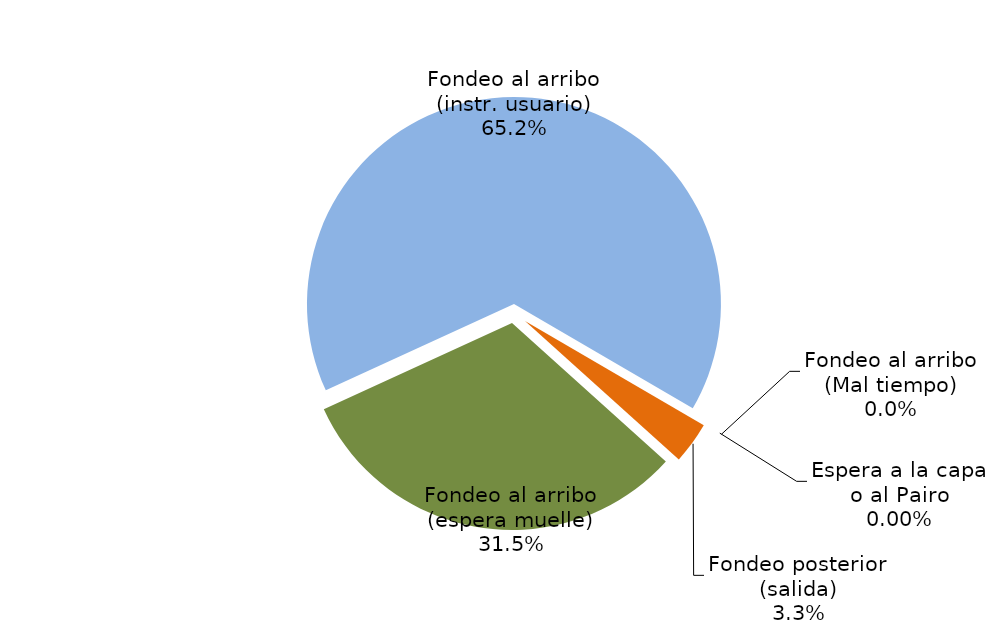
| Category | Series 0 |
|---|---|
| Fondeo al arribo (espera muelle) | 3830.979 |
| Fondeo al arribo (instr. usuario) | 7936.883 |
| Fondeo al arribo (Mal tiempo) | 0 |
| Espera a la capa o al Pairo | 0 |
| Fondeo posterior (salida) | 396.227 |